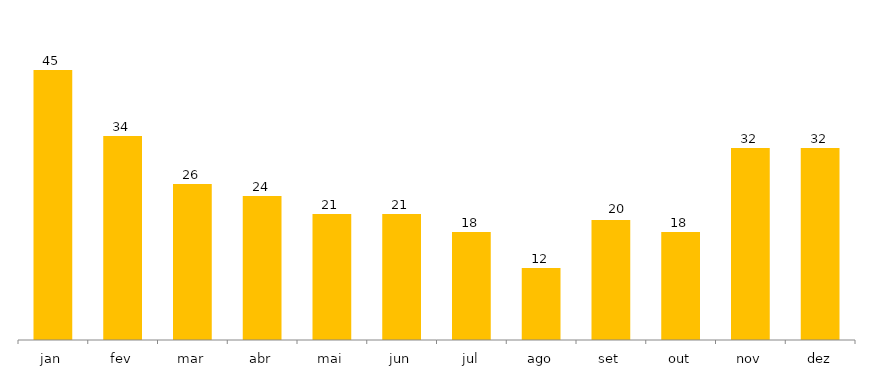
| Category | 2021 |
|---|---|
| jan | 45 |
| fev | 34 |
| mar | 26 |
| abr | 24 |
| mai | 21 |
| jun | 21 |
| jul | 18 |
| ago | 12 |
| set | 20 |
| out | 18 |
| nov | 32 |
| dez | 32 |